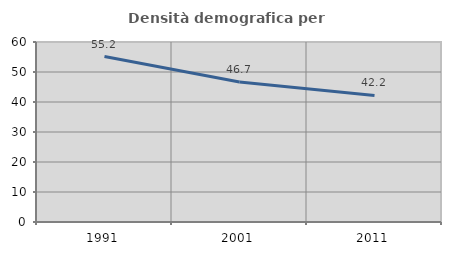
| Category | Densità demografica |
|---|---|
| 1991.0 | 55.162 |
| 2001.0 | 46.695 |
| 2011.0 | 42.203 |